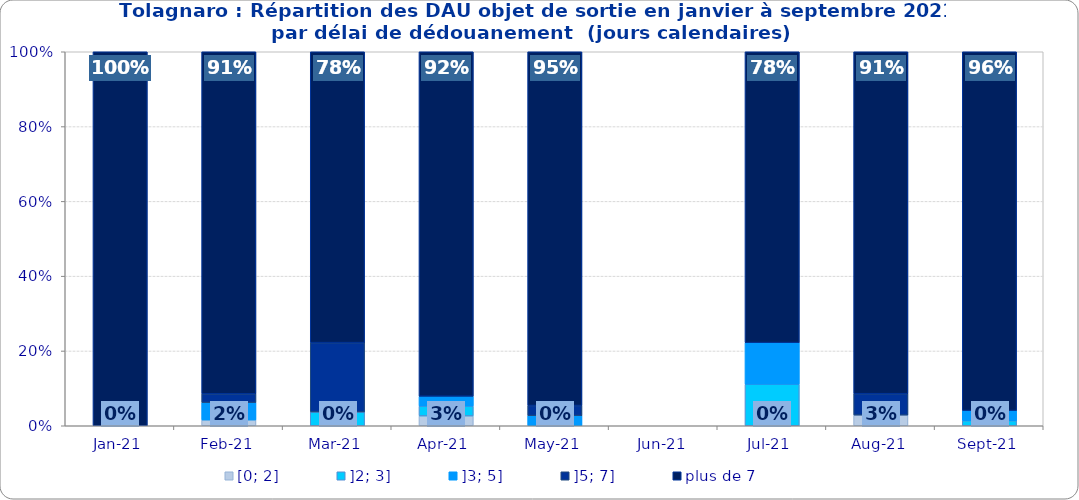
| Category | [0; 2] | ]2; 3] | ]3; 5] | ]5; 7] | plus de 7 |
|---|---|---|---|---|---|
| 2021-01-01 | 0 | 0 | 0 | 0 | 1 |
| 2021-02-01 | 0.016 | 0 | 0.047 | 0.023 | 0.915 |
| 2021-03-01 | 0 | 0.037 | 0 | 0.185 | 0.778 |
| 2021-04-01 | 0.026 | 0.026 | 0.026 | 0 | 0.921 |
| 2021-05-01 | 0 | 0 | 0.027 | 0.027 | 0.946 |
| 2021-06-01 | 0 | 0 | 0 | 0 | 0 |
| 2021-07-01 | 0 | 0.111 | 0.111 | 0 | 0.778 |
| 2021-08-01 | 0.029 | 0 | 0 | 0.057 | 0.914 |
| 2021-09-01 | 0 | 0.014 | 0.027 | 0 | 0.959 |